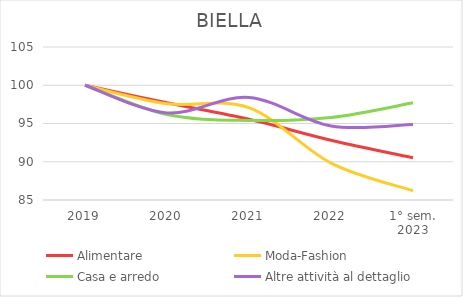
| Category | Alimentare | Moda-Fashion | Casa e arredo | Altre attività al dettaglio |
|---|---|---|---|---|
| 2019 | 100 | 100 | 100 | 100 |
| 2020 | 97.701 | 97.586 | 96.169 | 96.389 |
| 2021 | 95.546 | 97.069 | 95.402 | 98.395 |
| 2022 | 92.816 | 89.828 | 95.785 | 94.684 |
| 1° sem.
2023 | 90.517 | 86.207 | 97.701 | 94.885 |